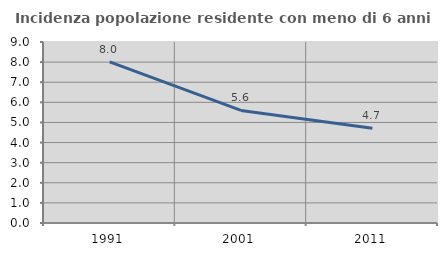
| Category | Incidenza popolazione residente con meno di 6 anni |
|---|---|
| 1991.0 | 8.014 |
| 2001.0 | 5.597 |
| 2011.0 | 4.709 |